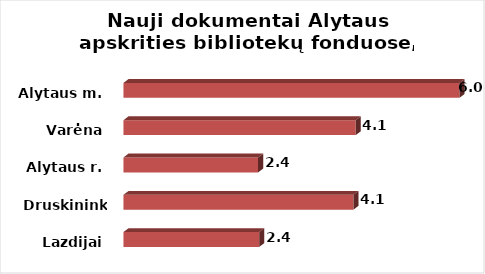
| Category | Series 0 |
|---|---|
| Lazdijai | 2.42 |
| Druskininkai | 4.1 |
| Alytaus r. | 2.4 |
| Varėna | 4.14 |
| Alytaus m. | 5.99 |